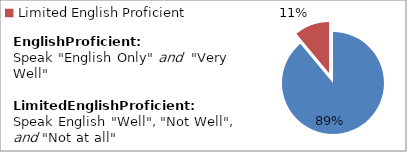
| Category | Percent |
|---|---|
| English Proficient | 0.889 |
| Limited English Proficient | 0.111 |